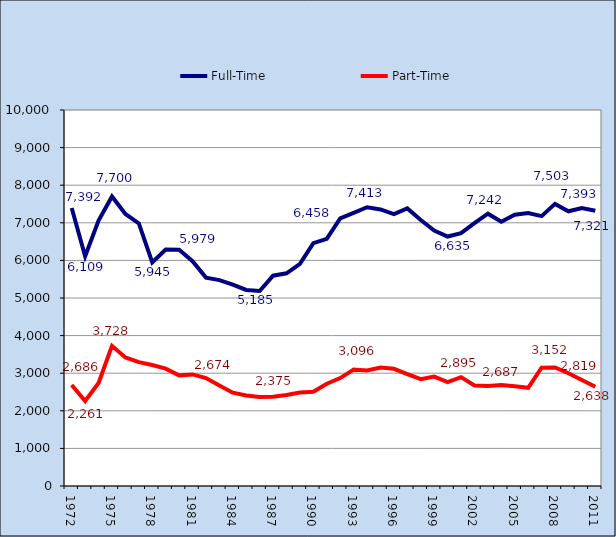
| Category | Full-Time | Part-Time |
|---|---|---|
| 1972.0 | 7392 | 2686 |
| 1973.0 | 6109 | 2261 |
| 1974.0 | 7059 | 2738 |
| 1975.0 | 7700 | 3728 |
| 1976.0 | 7236 | 3419 |
| 1977.0 | 6983 | 3293 |
| 1978.0 | 5945 | 3217 |
| 1979.0 | 6290 | 3122 |
| 1980.0 | 6285 | 2943 |
| 1981.0 | 5979 | 2968 |
| 1982.0 | 5542 | 2870 |
| 1983.0 | 5475 | 2674 |
| 1984.0 | 5355 | 2481 |
| 1985.0 | 5214 | 2406 |
| 1986.0 | 5185 | 2368 |
| 1987.0 | 5593 | 2375 |
| 1988.0 | 5656 | 2421 |
| 1989.0 | 5906 | 2487 |
| 1990.0 | 6458 | 2507 |
| 1991.0 | 6573 | 2719 |
| 1992.0 | 7120 | 2870 |
| 1993.0 | 7264 | 3096 |
| 1994.0 | 7413 | 3072 |
| 1995.0 | 7355 | 3150 |
| 1996.0 | 7230 | 3118 |
| 1997.0 | 7383 | 2978 |
| 1998.0 | 7075 | 2840 |
| 1999.0 | 6796 | 2911 |
| 2000.0 | 6635 | 2762 |
| 2001.0 | 6725 | 2895 |
| 2002.0 | 6992 | 2673 |
| 2003.0 | 7242 | 2658 |
| 2004.0 | 7026 | 2687 |
| 2005.0 | 7215 | 2651 |
| 2006.0 | 7261 | 2611 |
| 2007.0 | 7178 | 3146 |
| 2008.0 | 7503 | 3152 |
| 2009.0 | 7307 | 3000 |
| 2010.0 | 7393 | 2819 |
| 2011.0 | 7321 | 2638 |